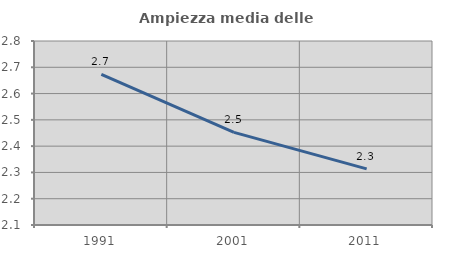
| Category | Ampiezza media delle famiglie |
|---|---|
| 1991.0 | 2.673 |
| 2001.0 | 2.452 |
| 2011.0 | 2.314 |